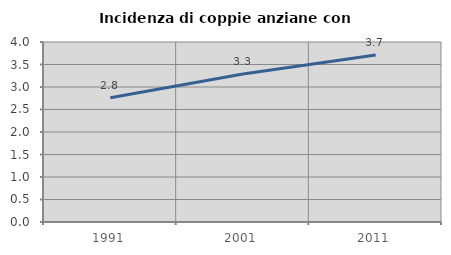
| Category | Incidenza di coppie anziane con figli |
|---|---|
| 1991.0 | 2.76 |
| 2001.0 | 3.29 |
| 2011.0 | 3.709 |